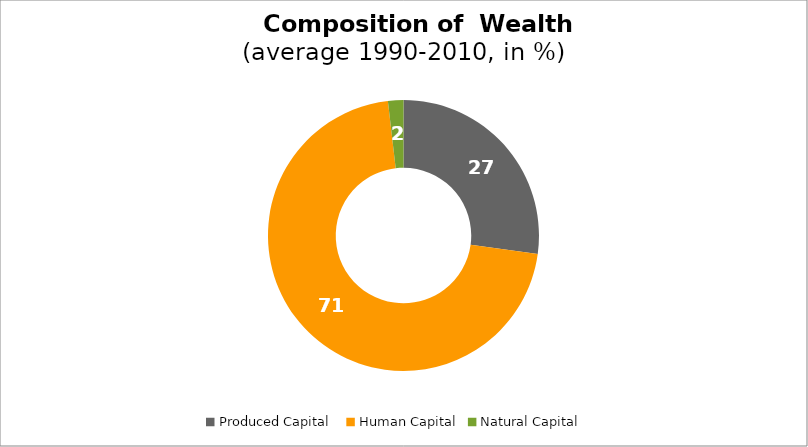
| Category | Series 0 |
|---|---|
| Produced Capital  | 27.179 |
| Human Capital | 70.982 |
| Natural Capital | 1.839 |